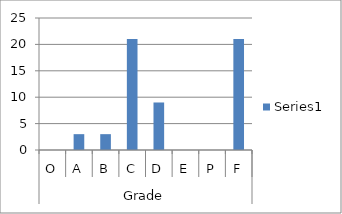
| Category | Series 0 |
|---|---|
| 0 | 0 |
| 1 | 3 |
| 2 | 3 |
| 3 | 21 |
| 4 | 9 |
| 5 | 0 |
| 6 | 0 |
| 7 | 21 |